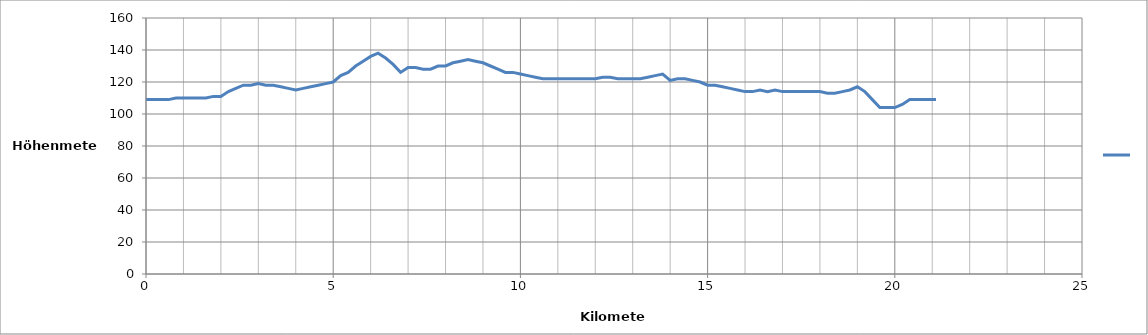
| Category | Series 0 |
|---|---|
| 0.0 | 109 |
| 0.2 | 109 |
| 0.4 | 109 |
| 0.6 | 109 |
| 0.8 | 110 |
| 1.0 | 110 |
| 1.2 | 110 |
| 1.4 | 110 |
| 1.6 | 110 |
| 1.8 | 111 |
| 2.0 | 111 |
| 2.2 | 114 |
| 2.4 | 116 |
| 2.6 | 118 |
| 2.8 | 118 |
| 3.0 | 119 |
| 3.2 | 118 |
| 3.4 | 118 |
| 3.6 | 117 |
| 3.8 | 116 |
| 4.0 | 115 |
| 4.2 | 116 |
| 4.4 | 117 |
| 4.6 | 118 |
| 4.8 | 119 |
| 5.0 | 120 |
| 5.2 | 124 |
| 5.4 | 126 |
| 5.6 | 130 |
| 5.8 | 133 |
| 6.0 | 136 |
| 6.2 | 138 |
| 6.4 | 135 |
| 6.6 | 131 |
| 6.8 | 126 |
| 7.0 | 129 |
| 7.2 | 129 |
| 7.4 | 128 |
| 7.6 | 128 |
| 7.8 | 130 |
| 8.0 | 130 |
| 8.2 | 132 |
| 8.4 | 133 |
| 8.6 | 134 |
| 8.8 | 133 |
| 9.0 | 132 |
| 9.2 | 130 |
| 9.4 | 128 |
| 9.6 | 126 |
| 9.8 | 126 |
| 10.0 | 125 |
| 10.2 | 124 |
| 10.4 | 123 |
| 10.6 | 122 |
| 10.8 | 122 |
| 11.0 | 122 |
| 11.2 | 122 |
| 11.4 | 122 |
| 11.6 | 122 |
| 11.8 | 122 |
| 12.0 | 122 |
| 12.2 | 123 |
| 12.4 | 123 |
| 12.6 | 122 |
| 12.8 | 122 |
| 13.0 | 122 |
| 13.2 | 122 |
| 13.4 | 123 |
| 13.6 | 124 |
| 13.8 | 125 |
| 14.0 | 121 |
| 14.2 | 122 |
| 14.4 | 122 |
| 14.6 | 121 |
| 14.8 | 120 |
| 15.0 | 118 |
| 15.2 | 118 |
| 15.4 | 117 |
| 15.6 | 116 |
| 15.8 | 115 |
| 16.0 | 114 |
| 16.2 | 114 |
| 16.4 | 115 |
| 16.6 | 114 |
| 16.8 | 115 |
| 17.0 | 114 |
| 17.2 | 114 |
| 17.4 | 114 |
| 17.6 | 114 |
| 17.8 | 114 |
| 18.0 | 114 |
| 18.2 | 113 |
| 18.4 | 113 |
| 18.6 | 114 |
| 18.8 | 115 |
| 19.0 | 117 |
| 19.2 | 114 |
| 19.4 | 109 |
| 19.6 | 104 |
| 19.8 | 104 |
| 20.0 | 104 |
| 20.2 | 106 |
| 20.4 | 109 |
| 20.6 | 109 |
| 20.8 | 109 |
| 21.0 | 109 |
| 21.1 | 109 |